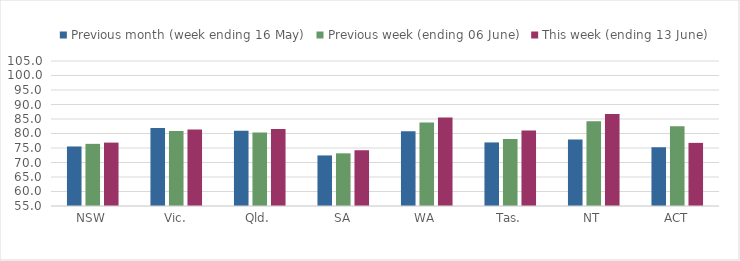
| Category | Previous month (week ending 16 May) | Previous week (ending 06 June) | This week (ending 13 June) |
|---|---|---|---|
| NSW | 75.527 | 76.428 | 76.86 |
| Vic. | 81.921 | 80.843 | 81.408 |
| Qld. | 80.951 | 80.378 | 81.546 |
| SA | 72.436 | 73.157 | 74.231 |
| WA | 80.81 | 83.833 | 85.557 |
| Tas. | 76.918 | 78.129 | 81.065 |
| NT | 77.947 | 84.248 | 86.762 |
| ACT | 75.262 | 82.526 | 76.767 |